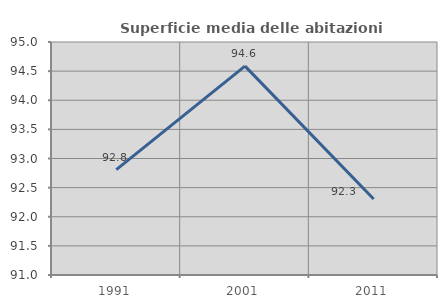
| Category | Superficie media delle abitazioni occupate |
|---|---|
| 1991.0 | 92.809 |
| 2001.0 | 94.586 |
| 2011.0 | 92.304 |